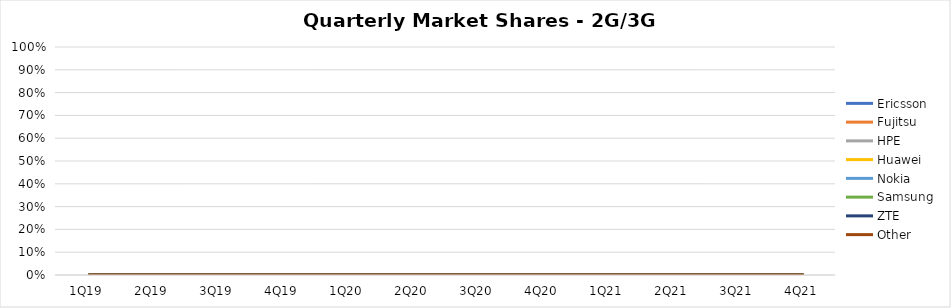
| Category | Ericsson | Fujitsu | HPE | Huawei | Nokia | Samsung | ZTE | Other |
|---|---|---|---|---|---|---|---|---|
| 1Q19 | 0 | 0 | 0 | 0 | 0 | 0 | 0 | 0 |
| 2Q19 | 0 | 0 | 0 | 0 | 0 | 0 | 0 | 0 |
| 3Q19 | 0 | 0 | 0 | 0 | 0 | 0 | 0 | 0 |
| 4Q19 | 0 | 0 | 0 | 0 | 0 | 0 | 0 | 0 |
| 1Q20 | 0 | 0 | 0 | 0 | 0 | 0 | 0 | 0 |
| 2Q20 | 0 | 0 | 0 | 0 | 0 | 0 | 0 | 0 |
| 3Q20 | 0 | 0 | 0 | 0 | 0 | 0 | 0 | 0 |
| 4Q20 | 0 | 0 | 0 | 0 | 0 | 0 | 0 | 0 |
| 1Q21 | 0 | 0 | 0 | 0 | 0 | 0 | 0 | 0 |
| 2Q21 | 0 | 0 | 0 | 0 | 0 | 0 | 0 | 0 |
| 3Q21 | 0 | 0 | 0 | 0 | 0 | 0 | 0 | 0 |
| 4Q21 | 0 | 0 | 0 | 0 | 0 | 0 | 0 | 0 |